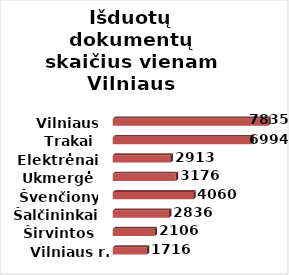
| Category | Series 0 |
|---|---|
| Vilniaus r. | 1716 |
| Širvintos | 2106 |
| Šalčininkai | 2836 |
| Švenčionys | 4060 |
| Ukmergė | 3176 |
| Elektrėnai | 2913 |
| Trakai | 6994 |
| Vilniaus m. | 7835 |